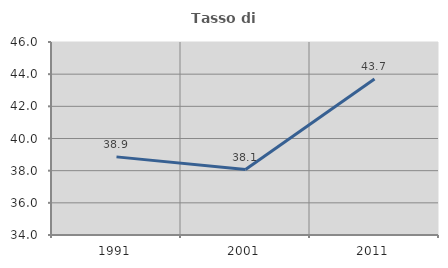
| Category | Tasso di occupazione   |
|---|---|
| 1991.0 | 38.858 |
| 2001.0 | 38.067 |
| 2011.0 | 43.705 |